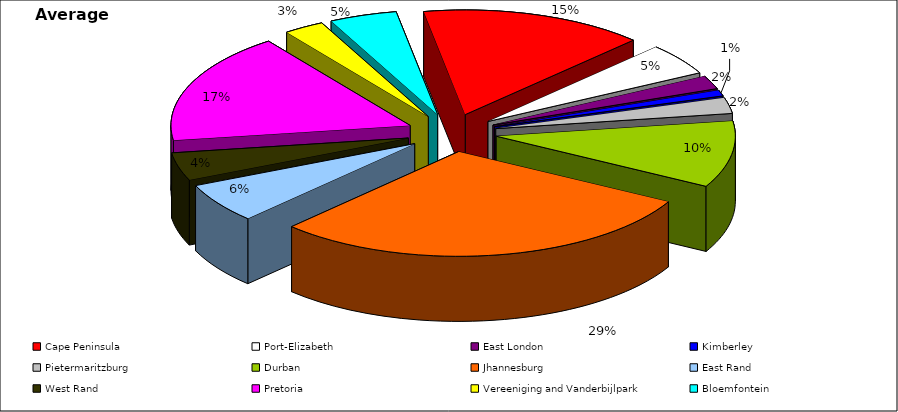
| Category | Average 2009 |
|---|---|
| Cape Peninsula | 11219.333 |
| Port-Elizabeth | 3618 |
| East London | 1506.667 |
| Kimberley | 668.833 |
| Pietermaritzburg | 1801.5 |
| Durban | 7597.583 |
| Jhannesburg | 21678.083 |
| East Rand | 4541.75 |
| West Rand | 3175.833 |
| Pretoria | 12696.75 |
| Vereeniging and Vanderbijlpark | 2025.167 |
| Bloemfontein | 3377.583 |